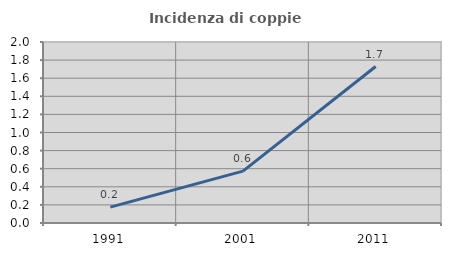
| Category | Incidenza di coppie miste |
|---|---|
| 1991.0 | 0.175 |
| 2001.0 | 0.573 |
| 2011.0 | 1.729 |